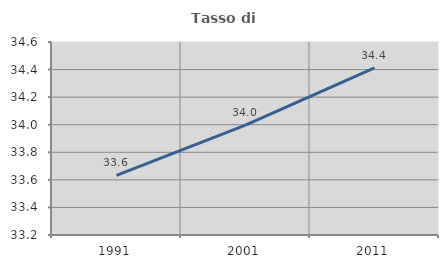
| Category | Tasso di occupazione   |
|---|---|
| 1991.0 | 33.632 |
| 2001.0 | 33.997 |
| 2011.0 | 34.412 |